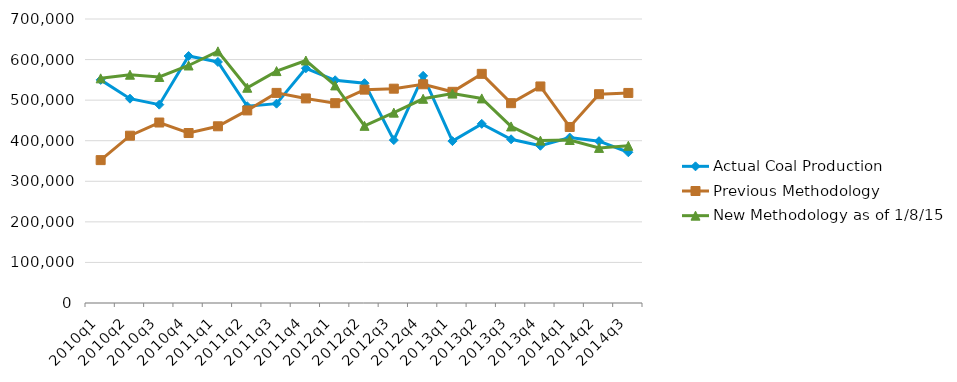
| Category | Actual Coal Production | Previous Methodology | New Methodology as of 1/8/15 |
|---|---|---|---|
| 2010q1 | 549940 | 352181 | 553706 |
| 2010q2 | 503580 | 412356 | 562681 |
| 2010q3 | 488855 | 444835 | 557093 |
| 2010q4 | 608719 | 418966 | 585417 |
| 2011q1 | 594202 | 435566 | 620241 |
| 2011q2 | 484928 | 474638 | 530551 |
| 2011q3 | 491313 | 517856 | 571634 |
| 2011q4 | 578483 | 504214 | 597701 |
| 2012q1 | 548973 | 492512 | 536247 |
| 2012q2 | 541719 | 525899 | 436676 |
| 2012q3 | 401547 | 528261 | 469208 |
| 2012q4 | 559847 | 539098 | 503306 |
| 2013q1 | 399024 | 520503 | 516173 |
| 2013q2 | 441577 | 564814 | 504275 |
| 2013q3 | 403427 | 492530 | 435223 |
| 2013q4 | 387556 | 533710 | 400325 |
| 2014q1 | 407780 | 433861 | 401727 |
| 2014q2 | 398842 | 514625 | 382301 |
| 2014q3 | 371509 | 517737 | 387458 |